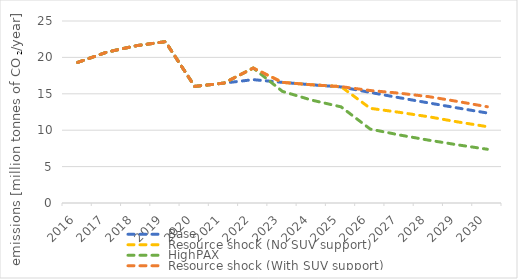
| Category | Base | Resource shock (No SUV support) | HighPAX | Resource shock (With SUV support) |
|---|---|---|---|---|
| 2016.0 | 19312500 | 19312500 | 19312500 | 19312500 |
| 2017.0 | 20725700 | 20725700 | 20725700 | 20725700 |
| 2018.0 | 21603200 | 21603200 | 21603200 | 21603200 |
| 2019.0 | 22162400 | 22162400 | 22162400 | 22162400 |
| 2020.0 | 16013400 | 16013400 | 16013400 | 16013400 |
| 2021.0 | 16471800 | 16471800 | 16471800 | 16471800 |
| 2022.0 | 16944300 | 18536800 | 18536800 | 18536800 |
| 2023.0 | 16569700 | 16569700 | 15328600 | 16569700 |
| 2024.0 | 16238400 | 16238400 | 14129500 | 16238400 |
| 2025.0 | 15942300 | 15983200 | 13209700 | 15983200 |
| 2026.0 | 15187200 | 13003900 | 10148600 | 15450000 |
| 2027.0 | 14455500 | 12452800 | 9342500 | 15083300 |
| 2028.0 | 13742800 | 11841700 | 8627160 | 14607100 |
| 2029.0 | 13045600 | 11128800 | 7979650 | 13936400 |
| 2030.0 | 12361000 | 10484600 | 7383570 | 13217100 |